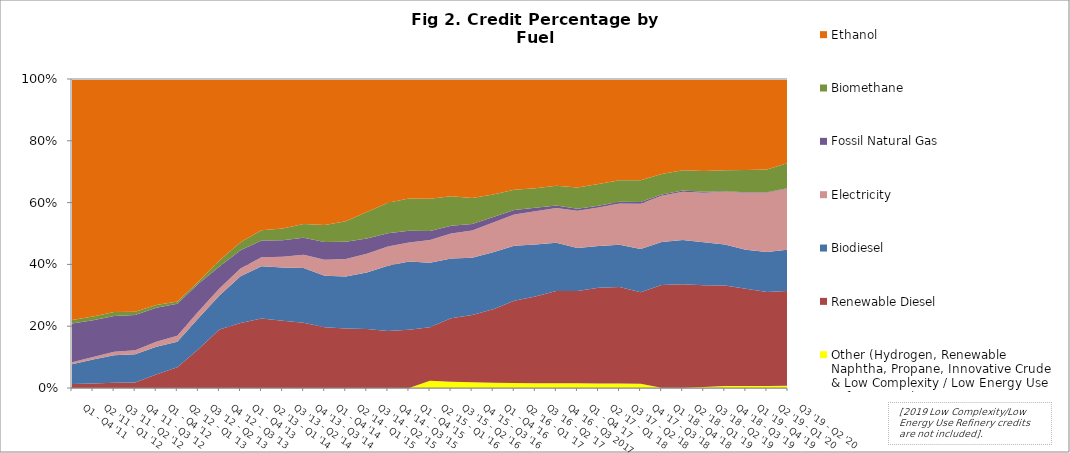
| Category | Other (Hydrogen, Renewable Naphtha, Propane, Innovative Crude & Low Complexity / Low Energy Use Refining, etc.) | Renewable Diesel | Biodiesel | Electricity | Fossil Natural Gas | Biomethane | Ethanol |
|---|---|---|---|---|---|---|---|
| Q1 - Q4 '11 | 0 | 4255 | 21066.75 | 1935.75 | 41097.5 | 3678.75 | 255888.25 |
| Q2 '11 - Q1 '12 | 0 | 5162.75 | 26837.25 | 2950.75 | 41170.5 | 4217.5 | 266727.25 |
| Q3 '11 - Q2 '12 | 0 | 6021.75 | 31928.25 | 4017.5 | 41417.75 | 4505.5 | 269743.5 |
| Q4 '11 - Q3 '12 | 0 | 6915.75 | 34835.25 | 5227.25 | 43542.5 | 4159.75 | 288811 |
| Q1 - Q4 '12 | 0 | 18164.75 | 37336.75 | 6746 | 45792.5 | 3711.25 | 304773.5 |
| Q2 '12 - Q1 '13 | 0 | 32600.75 | 40337.75 | 9379 | 50547.5 | 3679.5 | 351042.25 |
| Q3 '12 - Q2 '13 | 0 | 75473 | 60626 | 12868 | 54269.25 | 3920 | 394796.75 |
| Q4 '12 - Q3 '13 | 0 | 145738 | 84731.75 | 17304.25 | 54483.5 | 15309 | 451907.5 |
| Q1 - Q4 '13 | 0 | 197482.25 | 141667.5 | 23488.25 | 55463.75 | 24529.5 | 495969.5 |
| Q2 '13 - Q1 '14 | 0 | 229472.75 | 172125.5 | 30163.75 | 55062.5 | 33904.25 | 499193 |
| Q3 '13 - Q2 '14 | 0 | 237650.5 | 187184.5 | 38057.75 | 58140 | 42082 | 527117.75 |
| Q4 '13 - Q3 '14 | 0 | 230531.5 | 193299.25 | 46639.5 | 60638.5 | 47945.25 | 512500.5 |
| Q1 - Q4 '14 | 0 | 211244.75 | 179500 | 55332.5 | 61754 | 59889.5 | 507720.75 |
| Q2 '14 - Q1 '15 | 0 | 214231 | 186099.25 | 63321.25 | 62258.75 | 73466.5 | 511213.5 |
| Q3 '14 - Q2 '15 | 0 | 221521.75 | 212265.5 | 70066.25 | 57339.5 | 99950.75 | 499516 |
| Q4 '14 - Q3 '15 | 12.5 | 231039 | 264657.25 | 77983.75 | 54535.75 | 123151.25 | 502037.5 |
| Q1 - Q4 '15 | 18.5 | 259542.75 | 303477.5 | 84435 | 51397.75 | 143988 | 531188.5 |
| Q2 '15 - Q1 '16 | 37968.75 | 277096.75 | 335225.5 | 117624 | 47389.5 | 166678.25 | 622043.5 |
| Q3 '15 - Q2 '16 | 38112.25 | 384694.75 | 361311.75 | 152143.25 | 46374 | 178626.5 | 710200 |
| Q4 '15 - Q3 '16 | 39251.167 | 454443.5 | 387917 | 185794.25 | 44218.75 | 175902.25 | 805507.75 |
| Q1 - Q4 '16 | 39246.25 | 560304.25 | 434195.75 | 226175.75 | 42547.75 | 170663.75 | 879846.5 |
| Q2 '16 - Q1 '17 | 38815.333 | 644325.25 | 430204 | 244170.25 | 35648.75 | 158142 | 866449 |
| Q3 '16 - Q2 '17 | 38495.25 | 685591.75 | 412601.75 | 263683.25 | 27575.5 | 153610.25 | 866394.5 |
| Q4 '16 - Q3 2017 | 37963.75 | 752235 | 393268 | 282887.5 | 20837.5 | 161317.75 | 869357.25 |
| Q1 - Q4 '17 | 37501.5 | 741682.5 | 345519.5 | 299528.5 | 14623.5 | 170246.25 | 872056 |
| Q2 '17 - Q1 '18 | 37136.75 | 794697.25 | 345443.75 | 320878 | 14438.75 | 180942.75 | 870380.25 |
| Q3 '17 - Q2 '18 | 36755 | 811822.25 | 354343.5 | 346254.75 | 15099 | 180192.25 | 850128.25 |
| Q4 '17 - Q3 '18 | 36385.75 | 771975.75 | 366448.5 | 381588 | 15325 | 183354.75 | 854713.25 |
| Q1 '18 - Q4 '18 | 2920.55 | 936189.4 | 390857.2 | 420493.25 | 13381.6 | 186642.6 | 864746 |
| Q2 '18 - Q1 '19 | 3716.25 | 1026714.5 | 440743.667 | 480141.25 | 11149.167 | 200784.5 | 907316 |
| Q3 '18 - Q2 '19 | 9810.167 | 1089847 | 462522.833 | 530900.75 | 9553.667 | 223016.167 | 984941.75 |
| Q4 '18 - Q3 '19 | 21659.75 | 1147972.167 | 468386 | 599857.25 | 7699.667 | 239186.333 | 1039787.75 |
| Q1 '19 - Q4 '19 | 23543.667 | 1159218.667 | 467272.833 | 679882.75 | 6176.5 | 264199.667 | 1085533 |
| Q2 '19 - Q1 '20 | 25570.35 | 1151951.2 | 491299.4 | 729177.25 | 5785.2 | 280654.6 | 1110335.25 |
| Q3 '19 - Q2 '20 | 28240.5 | 1128502.5 | 491583.5 | 728931 | 5437.75 | 300837.5 | 1000430.25 |